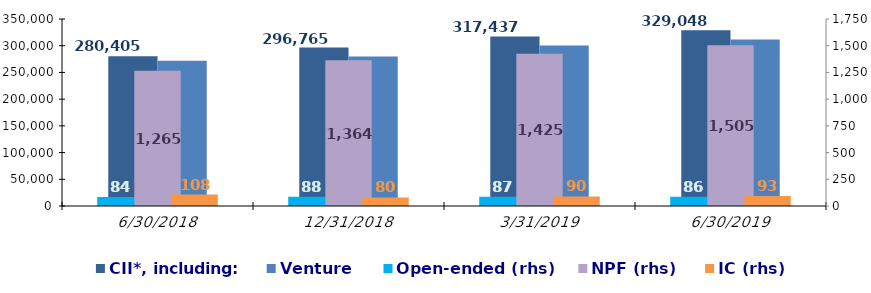
| Category | CII*, including: | Venture |
|---|---|---|
| 6/30/18 | 280405.018 | 272052.334 |
| 12/31/18 | 296765.381 | 279713.253 |
| 3/31/19 | 317437.485 | 300241.731 |
| 6/30/19 | 329047.523 | 311811.926 |